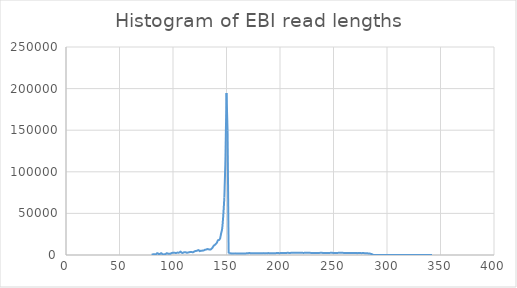
| Category | Series 0 |
|---|---|
| 80.0 | 352 |
| 81.0 | 675 |
| 82.0 | 943 |
| 83.0 | 782 |
| 84.0 | 859 |
| 85.0 | 2019 |
| 86.0 | 1837 |
| 87.0 | 746 |
| 88.0 | 1468 |
| 89.0 | 2250 |
| 90.0 | 1047 |
| 91.0 | 680 |
| 92.0 | 1037 |
| 93.0 | 1039 |
| 94.0 | 2204 |
| 95.0 | 1753 |
| 96.0 | 1561 |
| 97.0 | 1367 |
| 98.0 | 1811 |
| 99.0 | 2453 |
| 100.0 | 2662 |
| 101.0 | 2600 |
| 102.0 | 2549 |
| 103.0 | 2330 |
| 104.0 | 2907 |
| 105.0 | 2736 |
| 106.0 | 3023 |
| 107.0 | 4102 |
| 108.0 | 2821 |
| 109.0 | 2500 |
| 110.0 | 3112 |
| 111.0 | 3180 |
| 112.0 | 3296 |
| 113.0 | 2686 |
| 114.0 | 2974 |
| 115.0 | 3269 |
| 116.0 | 3595 |
| 117.0 | 3588 |
| 118.0 | 3434 |
| 119.0 | 3448 |
| 120.0 | 4320 |
| 121.0 | 4776 |
| 122.0 | 4975 |
| 123.0 | 5453 |
| 124.0 | 5880 |
| 125.0 | 4630 |
| 126.0 | 5163 |
| 127.0 | 5170 |
| 128.0 | 5369 |
| 129.0 | 5645 |
| 130.0 | 6333 |
| 131.0 | 6535 |
| 132.0 | 7112 |
| 133.0 | 6848 |
| 134.0 | 6673 |
| 135.0 | 6533 |
| 136.0 | 7492 |
| 137.0 | 8942 |
| 138.0 | 11052 |
| 139.0 | 12073 |
| 140.0 | 13205 |
| 141.0 | 14780 |
| 142.0 | 17676 |
| 143.0 | 18054 |
| 144.0 | 19885 |
| 145.0 | 26061 |
| 146.0 | 32083 |
| 147.0 | 47799 |
| 148.0 | 68961 |
| 149.0 | 114274 |
| 150.0 | 194612 |
| 151.0 | 149318 |
| 152.0 | 2228 |
| 153.0 | 1731 |
| 154.0 | 2040 |
| 155.0 | 1739 |
| 156.0 | 1874 |
| 157.0 | 1833 |
| 158.0 | 1961 |
| 159.0 | 1780 |
| 160.0 | 1881 |
| 161.0 | 1915 |
| 162.0 | 1789 |
| 163.0 | 1854 |
| 164.0 | 1842 |
| 165.0 | 1770 |
| 166.0 | 1845 |
| 167.0 | 1799 |
| 168.0 | 1897 |
| 169.0 | 2031 |
| 170.0 | 2032 |
| 171.0 | 2307 |
| 172.0 | 2258 |
| 173.0 | 1998 |
| 174.0 | 2060 |
| 175.0 | 2125 |
| 176.0 | 1988 |
| 177.0 | 2006 |
| 178.0 | 2228 |
| 179.0 | 2204 |
| 180.0 | 2136 |
| 181.0 | 1973 |
| 182.0 | 2112 |
| 183.0 | 2125 |
| 184.0 | 2097 |
| 185.0 | 2264 |
| 186.0 | 2059 |
| 187.0 | 2253 |
| 188.0 | 2139 |
| 189.0 | 2311 |
| 190.0 | 2129 |
| 191.0 | 2144 |
| 192.0 | 2204 |
| 193.0 | 2138 |
| 194.0 | 2139 |
| 195.0 | 2177 |
| 196.0 | 2210 |
| 197.0 | 2347 |
| 198.0 | 2334 |
| 199.0 | 2248 |
| 200.0 | 2251 |
| 201.0 | 2313 |
| 202.0 | 2419 |
| 203.0 | 2350 |
| 204.0 | 2540 |
| 205.0 | 2520 |
| 206.0 | 2431 |
| 207.0 | 2682 |
| 208.0 | 2553 |
| 209.0 | 2418 |
| 210.0 | 2559 |
| 211.0 | 2637 |
| 212.0 | 2673 |
| 213.0 | 2592 |
| 214.0 | 2694 |
| 215.0 | 2743 |
| 216.0 | 2585 |
| 217.0 | 2779 |
| 218.0 | 2571 |
| 219.0 | 2699 |
| 220.0 | 2664 |
| 221.0 | 2623 |
| 222.0 | 2514 |
| 223.0 | 2650 |
| 224.0 | 2773 |
| 225.0 | 2747 |
| 226.0 | 2810 |
| 227.0 | 2594 |
| 228.0 | 2647 |
| 229.0 | 2454 |
| 230.0 | 2542 |
| 231.0 | 2404 |
| 232.0 | 2455 |
| 233.0 | 2430 |
| 234.0 | 2433 |
| 235.0 | 2506 |
| 236.0 | 2549 |
| 237.0 | 2543 |
| 238.0 | 2593 |
| 239.0 | 2652 |
| 240.0 | 2469 |
| 241.0 | 2397 |
| 242.0 | 2506 |
| 243.0 | 2421 |
| 244.0 | 2504 |
| 245.0 | 2486 |
| 246.0 | 2486 |
| 247.0 | 2578 |
| 248.0 | 2679 |
| 249.0 | 2591 |
| 250.0 | 2433 |
| 251.0 | 2535 |
| 252.0 | 2504 |
| 253.0 | 2526 |
| 254.0 | 2535 |
| 255.0 | 2603 |
| 256.0 | 2589 |
| 257.0 | 2678 |
| 258.0 | 2637 |
| 259.0 | 2563 |
| 260.0 | 2386 |
| 261.0 | 2437 |
| 262.0 | 2443 |
| 263.0 | 2509 |
| 264.0 | 2490 |
| 265.0 | 2444 |
| 266.0 | 2434 |
| 267.0 | 2368 |
| 268.0 | 2446 |
| 269.0 | 2523 |
| 270.0 | 2404 |
| 271.0 | 2424 |
| 272.0 | 2230 |
| 273.0 | 2352 |
| 274.0 | 2322 |
| 275.0 | 2329 |
| 276.0 | 2245 |
| 277.0 | 2266 |
| 278.0 | 2332 |
| 279.0 | 2212 |
| 280.0 | 2044 |
| 281.0 | 1965 |
| 282.0 | 1963 |
| 283.0 | 1857 |
| 284.0 | 1712 |
| 285.0 | 1352 |
| 286.0 | 947 |
| 287.0 | 182 |
| 288.0 | 1 |
| 291.0 | 2 |
| 296.0 | 1 |
| 299.0 | 1 |
| 300.0 | 1 |
| 303.0 | 1 |
| 305.0 | 1 |
| 311.0 | 1 |
| 312.0 | 1 |
| 315.0 | 1 |
| 317.0 | 1 |
| 319.0 | 1 |
| 320.0 | 1 |
| 322.0 | 2 |
| 323.0 | 1 |
| 325.0 | 5 |
| 326.0 | 2 |
| 328.0 | 2 |
| 329.0 | 1 |
| 330.0 | 2 |
| 331.0 | 1 |
| 332.0 | 1 |
| 333.0 | 1 |
| 335.0 | 1 |
| 336.0 | 1 |
| 342.0 | 1 |